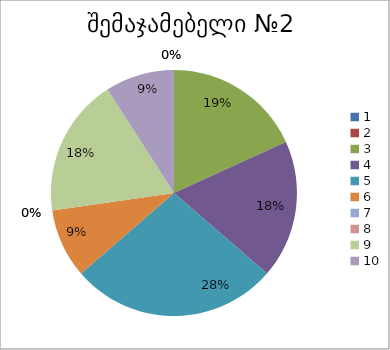
| Category | რაოდენობა | ქულა |
|---|---|---|
| 0 | 0 | 1 |
| 1 | 0 | 2 |
| 2 | 2 | 3 |
| 3 | 2 | 4 |
| 4 | 3 | 5 |
| 5 | 1 | 6 |
| 6 | 0 | 7 |
| 7 | 0 | 8 |
| 8 | 2 | 9 |
| 9 | 1 | 10 |